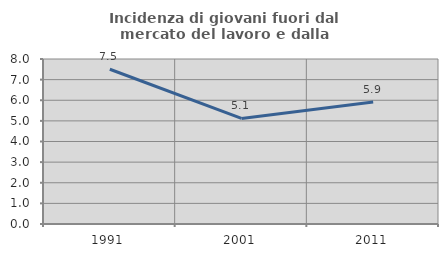
| Category | Incidenza di giovani fuori dal mercato del lavoro e dalla formazione  |
|---|---|
| 1991.0 | 7.504 |
| 2001.0 | 5.117 |
| 2011.0 | 5.91 |